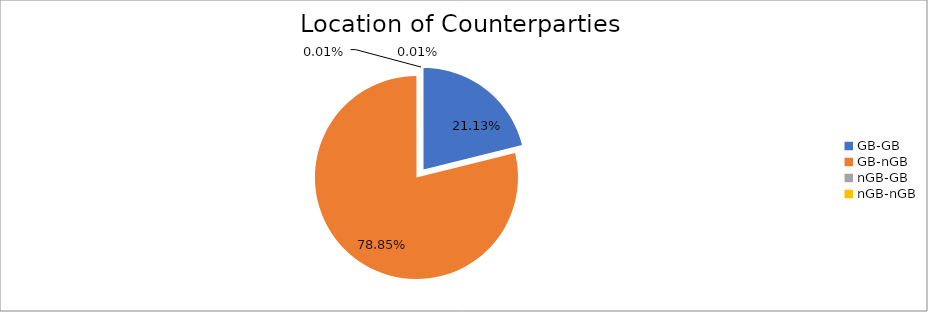
| Category | Series 0 |
|---|---|
| GB-GB | 2035185.047 |
| GB-nGB | 7593635.576 |
| nGB-GB | 496.066 |
| nGB-nGB | 1051.351 |